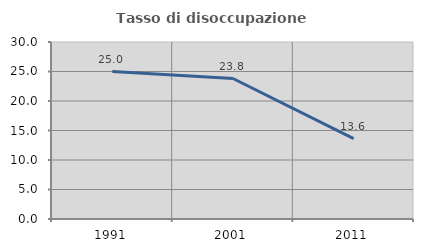
| Category | Tasso di disoccupazione giovanile  |
|---|---|
| 1991.0 | 25 |
| 2001.0 | 23.81 |
| 2011.0 | 13.636 |